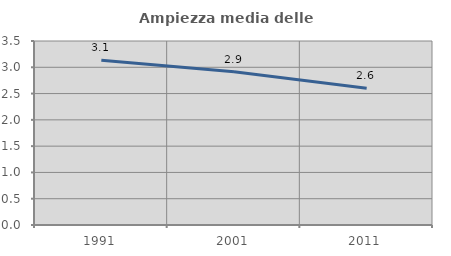
| Category | Ampiezza media delle famiglie |
|---|---|
| 1991.0 | 3.135 |
| 2001.0 | 2.917 |
| 2011.0 | 2.6 |